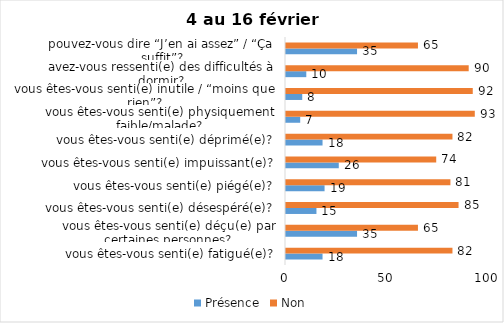
| Category | Présence | Non |
|---|---|---|
| vous êtes-vous senti(e) fatigué(e)? | 18 | 82 |
| vous êtes-vous senti(e) déçu(e) par certaines personnes? | 35 | 65 |
| vous êtes-vous senti(e) désespéré(e)? | 15 | 85 |
| vous êtes-vous senti(e) piégé(e)? | 19 | 81 |
| vous êtes-vous senti(e) impuissant(e)? | 26 | 74 |
| vous êtes-vous senti(e) déprimé(e)? | 18 | 82 |
| vous êtes-vous senti(e) physiquement faible/malade? | 7 | 93 |
| vous êtes-vous senti(e) inutile / “moins que rien”? | 8 | 92 |
| avez-vous ressenti(e) des difficultés à dormir? | 10 | 90 |
| pouvez-vous dire “J’en ai assez” / “Ça suffit”? | 35 | 65 |